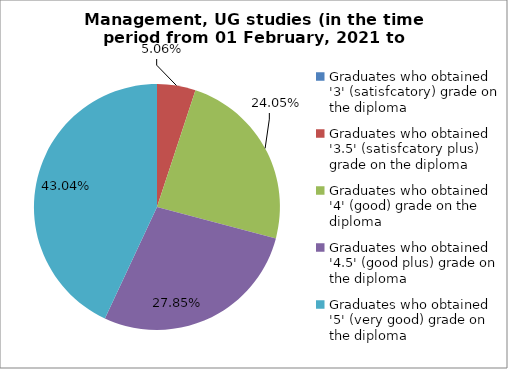
| Category | Series 0 |
|---|---|
| Graduates who obtained '3' (satisfcatory) grade on the diploma  | 0 |
| Graduates who obtained '3.5' (satisfcatory plus) grade on the diploma  | 5.063 |
| Graduates who obtained '4' (good) grade on the diploma  | 24.051 |
| Graduates who obtained '4.5' (good plus) grade on the diploma  | 27.848 |
| Graduates who obtained '5' (very good) grade on the diploma  | 43.038 |